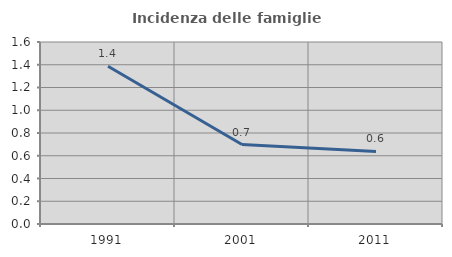
| Category | Incidenza delle famiglie numerose |
|---|---|
| 1991.0 | 1.387 |
| 2001.0 | 0.698 |
| 2011.0 | 0.638 |